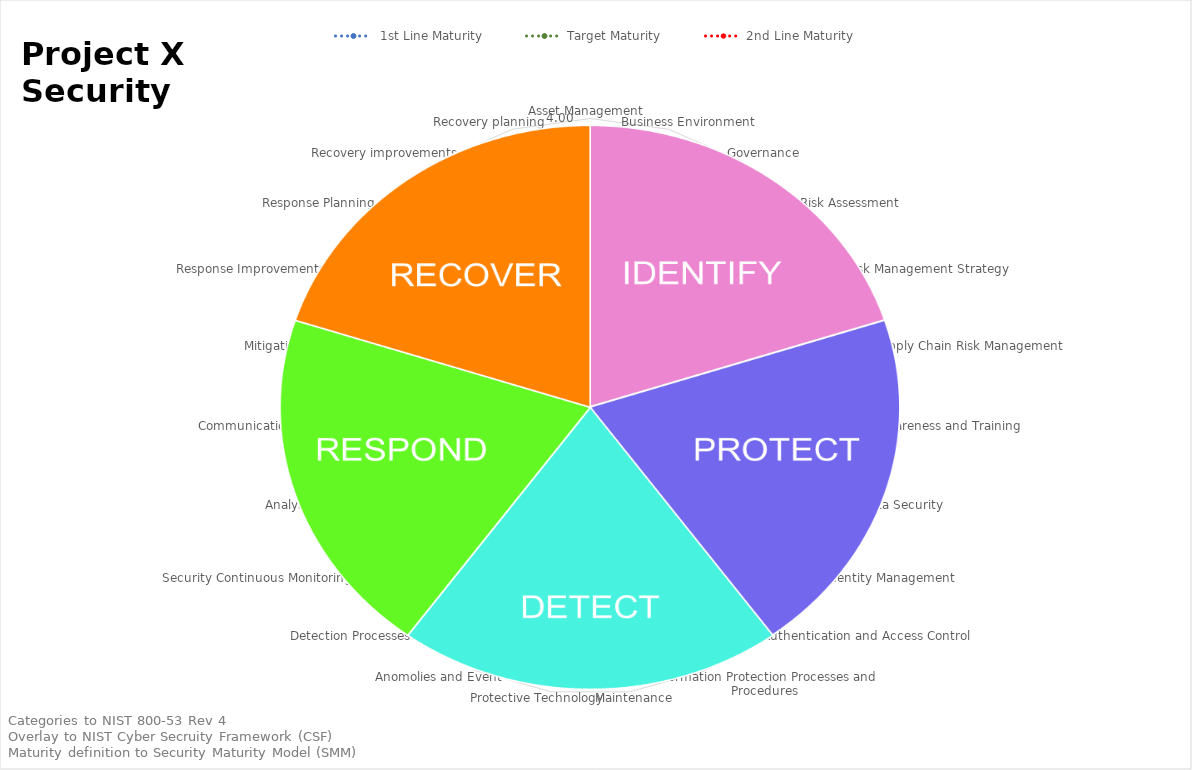
| Category |  1st Line Maturity | Target Maturity | 2nd Line Maturity |
|---|---|---|---|
| Asset Management  | 0 | 2 | 0 |
| Business Environment  | 0 | 2 | 0 |
| Governance  | 0 | 2 | 0 |
| Risk Assessment  | 0 | 2 | 0 |
| Risk Management Strategy  | 0 | 2 | 0 |
| Supply Chain Risk Management  | 0 | 2 | 0 |
| Awareness and Training | 0 | 2 | 0 |
| Data Security | 0 | 2 | 0 |
| Identity Management, Authentication and Access Control | 0 | 2 | 0 |
| Information Protection Processes and Procedures | 0 | 2 | 0 |
| Maintenance | 0 | 2 | 0 |
| Protective Technology | 0 | 2 | 0 |
| Anomolies and Event | 0 | 2 | 0 |
| Detection Processes | 0 | 2 | 0 |
| Security Continuous Monitoring | 0 | 2 | 0 |
| Analysis | 0 | 2 | 0 |
| Communications | 0 | 2 | 0 |
| Mitigation | 0 | 2 | 0 |
| Response Improvements  | 0 | 2 | 0 |
| Response Planning | 0 | 2 | 0 |
| Recovery improvements | 0 | 2 | 0 |
| Recovery planning | 0 | 2 | 0 |
| Stakeholder Relations | 0 | 2 | 0 |